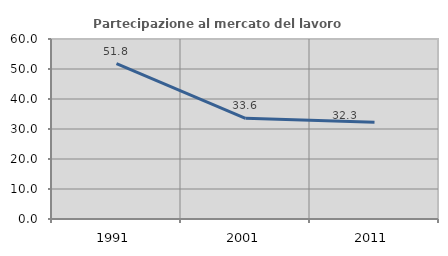
| Category | Partecipazione al mercato del lavoro  femminile |
|---|---|
| 1991.0 | 51.812 |
| 2001.0 | 33.571 |
| 2011.0 | 32.288 |